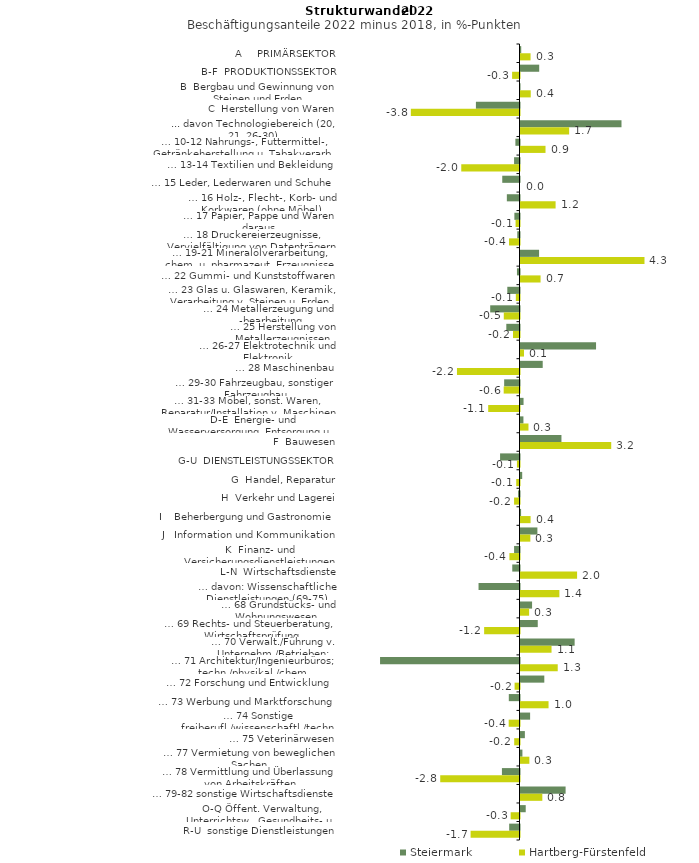
| Category | Steiermark | Hartberg-Fürstenfeld |
|---|---|---|
| A     PRIMÄRSEKTOR | 0.025 | 0.35 |
| B-F  PRODUKTIONSSEKTOR | 0.65 | -0.257 |
| B  Bergbau und Gewinnung von Steinen und Erden | -0.011 | 0.357 |
| C  Herstellung von Waren | -1.516 | -3.779 |
| ... davon Technologiebereich (20, 21, 26-30) | 3.513 | 1.692 |
| … 10-12 Nahrungs-, Futtermittel-, Getränkeherstellung u. Tabakverarb. | -0.143 | 0.87 |
| … 13-14 Textilien und Bekleidung | -0.189 | -2.026 |
| … 15 Leder, Lederwaren und Schuhe | -0.6 | 0 |
| … 16 Holz-, Flecht-, Korb- und Korkwaren (ohne Möbel)  | -0.44 | 1.221 |
| … 17 Papier, Pappe und Waren daraus  | -0.178 | -0.137 |
| … 18 Druckereierzeugnisse, Vervielfältigung von Datenträgern | -0.077 | -0.364 |
| … 19-21 Mineralölverarbeitung, chem. u. pharmazeut. Erzeugnisse | 0.646 | 4.313 |
| … 22 Gummi- und Kunststoffwaren | -0.089 | 0.698 |
| … 23 Glas u. Glaswaren, Keramik, Verarbeitung v. Steinen u. Erden  | -0.424 | -0.128 |
| … 24 Metallerzeugung und -bearbeitung | -1.019 | -0.547 |
| … 25 Herstellung von Metallerzeugnissen  | -0.459 | -0.225 |
| … 26-27 Elektrotechnik und Elektronik | 2.628 | 0.122 |
| … 28 Maschinenbau | 0.773 | -2.175 |
| … 29-30 Fahrzeugbau, sonstiger Fahrzeugbau | -0.534 | -0.55 |
| … 31-33 Möbel, sonst. Waren, Reparatur/Installation v. Maschinen | 0.106 | -1.089 |
| D-E  Energie- und Wasserversorgung, Entsorgung u. Rückgewinnung | 0.102 | 0.278 |
| F  Bauwesen | 1.424 | 3.155 |
| G-U  DIENSTLEISTUNGSSEKTOR | -0.676 | -0.089 |
| G  Handel, Reparatur | 0.059 | -0.114 |
| H  Verkehr und Lagerei | -0.05 | -0.189 |
| I    Beherbergung und Gastronomie | 0.02 | 0.351 |
| J   Information und Kommunikation | 0.588 | 0.343 |
| K  Finanz- und Versicherungsdienstleistungen | -0.188 | -0.351 |
| L-N  Wirtschaftsdienste | -0.252 | 1.968 |
| … davon: Wissenschaftliche Dienstleistungen (69-75) | -1.425 | 1.352 |
| … 68 Grundstücks- und Wohnungswesen  | 0.402 | 0.3 |
| … 69 Rechts- und Steuerberatung, Wirtschaftsprüfung | 0.6 | -1.23 |
| … 70 Verwalt./Führung v. Unternehm./Betrieben; Unternehmensberat. | 1.883 | 1.08 |
| … 71 Architektur/Ingenieurbüros; techn./physikal./chem. Untersuchung | -4.85 | 1.295 |
| … 72 Forschung und Entwicklung  | 0.828 | -0.171 |
| … 73 Werbung und Marktforschung | -0.372 | 0.975 |
| … 74 Sonstige freiberufl./wissenschaftl./techn. Tätigkeiten | 0.334 | -0.376 |
| … 75 Veterinärwesen | 0.152 | -0.184 |
| … 77 Vermietung von beweglichen Sachen  | 0.067 | 0.308 |
| … 78 Vermittlung und Überlassung von Arbeitskräften | -0.611 | -2.757 |
| … 79-82 sonstige Wirtschaftsdienste | 1.569 | 0.759 |
| O-Q Öffent. Verwaltung, Unterrichtsw., Gesundheits- u. Sozialwesen | 0.182 | -0.308 |
| R-U  sonstige Dienstleistungen | -0.359 | -1.701 |